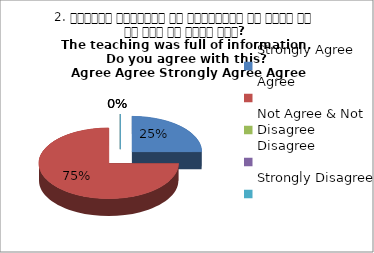
| Category | 2. शिक्षण जानकारी से परिपूर्ण था क्या आप इस बात से सहमत हैं?
The teaching was full of information. Do you agree with this?
 Agree Agree Strongly Agree Agree |
|---|---|
| Strongly Agree | 1 |
| Agree | 3 |
| Not Agree & Not Disagree | 0 |
| Disagree | 0 |
| Strongly Disagree | 0 |